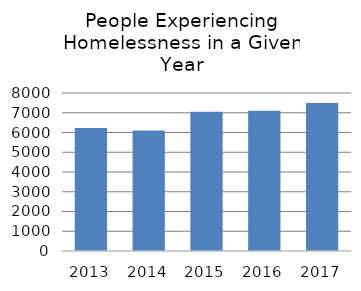
| Category | Series 0 |
|---|---|
| 2013.0 | 6232 |
| 2014.0 | 6104 |
| 2015.0 | 7054 |
| 2016.0 | 7101 |
| 2017.0 | 7498 |